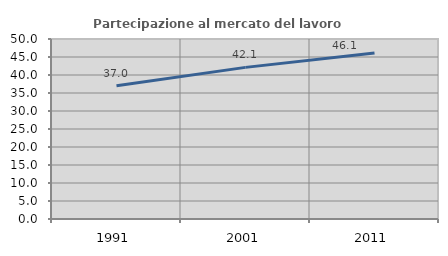
| Category | Partecipazione al mercato del lavoro  femminile |
|---|---|
| 1991.0 | 36.99 |
| 2001.0 | 42.117 |
| 2011.0 | 46.125 |